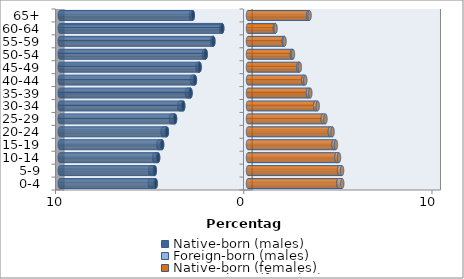
| Category | Native-born (males) | Foreign-born (males) | Native-born (females) | Foreign-born (females) |
|---|---|---|---|---|
| 0-4 | -4.907 | -0.305 | 4.802 | 0.203 |
| 5-9 | -4.954 | -0.24 | 4.837 | 0.159 |
| 10-14 | -4.776 | -0.207 | 4.697 | 0.137 |
| 15-19 | -4.564 | -0.194 | 4.543 | 0.127 |
| 20-24 | -4.311 | -0.222 | 4.349 | 0.143 |
| 25-29 | -3.877 | -0.217 | 3.976 | 0.138 |
| 30-34 | -3.443 | -0.206 | 3.572 | 0.132 |
| 35-39 | -3.055 | -0.185 | 3.19 | 0.12 |
| 40-44 | -2.821 | -0.149 | 2.945 | 0.097 |
| 45-49 | -2.572 | -0.111 | 2.68 | 0.071 |
| 50-54 | -2.25 | -0.089 | 2.332 | 0.056 |
| 55-59 | -1.841 | -0.063 | 1.902 | 0.04 |
| 60-64 | -1.371 | -0.056 | 1.427 | 0.036 |
| 65+ | -2.934 | -0.101 | 3.204 | 0.066 |